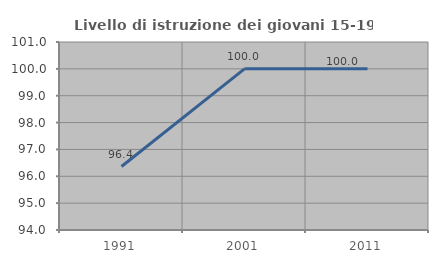
| Category | Livello di istruzione dei giovani 15-19 anni |
|---|---|
| 1991.0 | 96.364 |
| 2001.0 | 100 |
| 2011.0 | 100 |